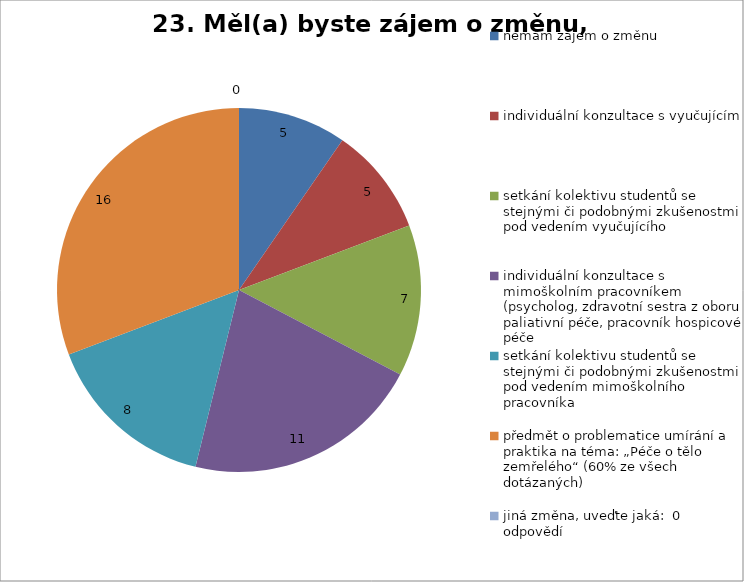
| Category | 23. Měl(a) byste zájem o změnu, například:  |
|---|---|
| nemám zájem o změnu  | 5 |
| individuální konzultace s vyučujícím  | 5 |
| setkání kolektivu studentů se stejnými či podobnými zkušenostmi pod vedením vyučujícího  | 7 |
| individuální konzultace s mimoškolním pracovníkem (psycholog, zdravotní sestra z oboru paliativní péče, pracovník hospicové péče  | 11 |
| setkání kolektivu studentů se stejnými či podobnými zkušenostmi pod vedením mimoškolního pracovníka  | 8 |
| předmět o problematice umírání a praktika na téma: „Péče o tělo zemřelého“ (60% ze všech dotázaných) | 16 |
| jiná změna, uveďte jaká:  0 odpovědí | 0 |